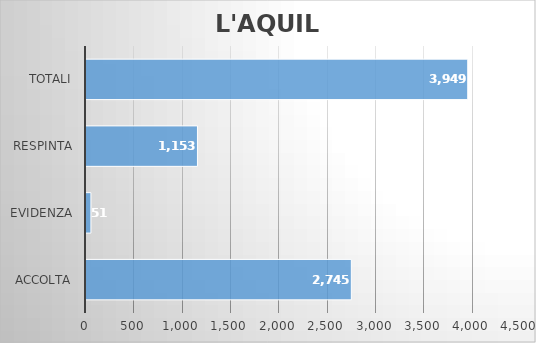
| Category | L'AQUILA |
|---|---|
| ACCOLTA | 2745 |
| EVIDENZA | 51 |
| RESPINTA | 1153 |
| Totali | 3949 |